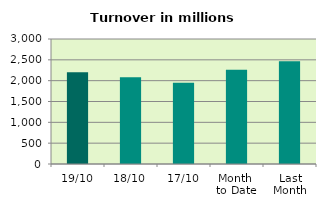
| Category | Series 0 |
|---|---|
| 19/10 | 2203.384 |
| 18/10 | 2081.949 |
| 17/10 | 1952.926 |
| Month 
to Date | 2261.555 |
| Last
Month | 2468.023 |